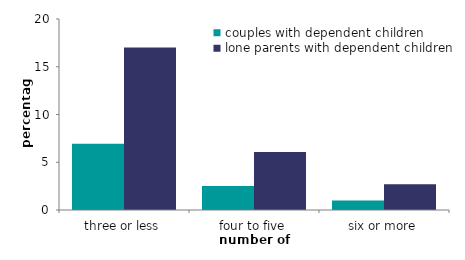
| Category | couples with dependent children | lone parents with dependent children  |
|---|---|---|
| three or less | 6.942 | 17.017 |
| four to five | 2.525 | 6.085 |
| six or more | 0.993 | 2.702 |